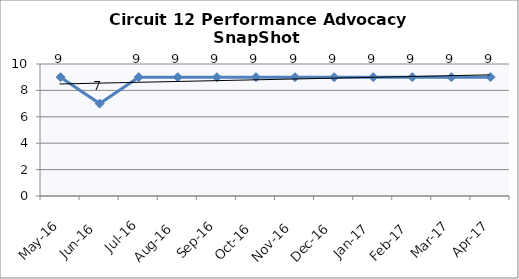
| Category | Circuit 12 |
|---|---|
| May-16 | 9 |
| Jun-16 | 7 |
| Jul-16 | 9 |
| Aug-16 | 9 |
| Sep-16 | 9 |
| Oct-16 | 9 |
| Nov-16 | 9 |
| Dec-16 | 9 |
| Jan-17 | 9 |
| Feb-17 | 9 |
| Mar-17 | 9 |
| Apr-17 | 9 |